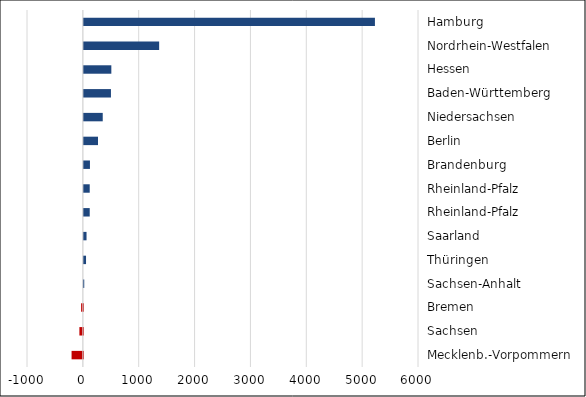
| Category | Series 0 |
|---|---|
| Mecklenb.-Vorpommern | -202 |
| Sachsen | -62 |
| Bremen | -31 |
| Sachsen-Anhalt | 7 |
| Thüringen | 39 |
| Saarland | 48 |
| Rheinland-Pfalz | 105 |
| Rheinland-Pfalz | 105 |
| Brandenburg | 109 |
| Berlin | 253 |
| Niedersachsen | 338 |
| Baden-Württemberg | 485 |
| Hessen | 492 |
| Nordrhein-Westfalen | 1348 |
| Hamburg | 5211 |